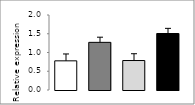
| Category | Series 0 |
|---|---|
| 0 | 0.778 |
| 1 | 1.271 |
| 2 | 0.786 |
| 3 | 1.506 |